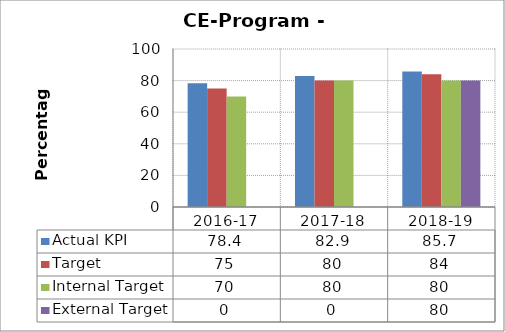
| Category | Actual KPI | Target  | Internal Target | External Target  |
|---|---|---|---|---|
| 2016-17 | 78.4 | 75 | 70 | 0 |
| 2017-18 | 82.9 | 80 | 80 | 0 |
| 2018-19 | 85.7 | 84 | 80 | 80 |